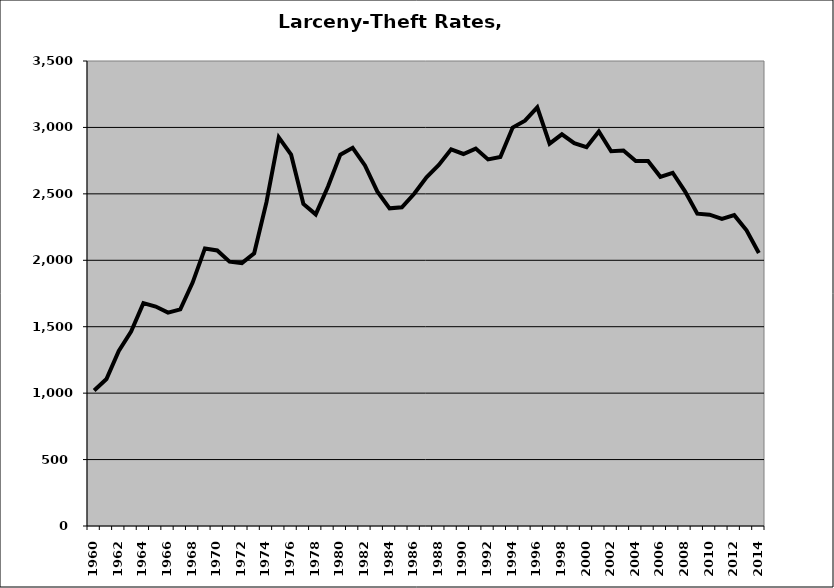
| Category | Larceny-Theft |
|---|---|
| 1960.0 | 1019.697 |
| 1961.0 | 1106.213 |
| 1962.0 | 1317.925 |
| 1963.0 | 1464.187 |
| 1964.0 | 1677.546 |
| 1965.0 | 1651.746 |
| 1966.0 | 1606.278 |
| 1967.0 | 1630.741 |
| 1968.0 | 1832.267 |
| 1969.0 | 2089.25 |
| 1970.0 | 2073.888 |
| 1971.0 | 1989.724 |
| 1972.0 | 1978.771 |
| 1973.0 | 2052.554 |
| 1974.0 | 2437.262 |
| 1975.0 | 2924.69 |
| 1976.0 | 2794.935 |
| 1977.0 | 2424.203 |
| 1978.0 | 2345.514 |
| 1979.0 | 2555.423 |
| 1980.0 | 2795.143 |
| 1981.0 | 2846.638 |
| 1982.0 | 2714.26 |
| 1983.0 | 2517.907 |
| 1984.0 | 2391.154 |
| 1985.0 | 2399.085 |
| 1986.0 | 2500.474 |
| 1987.0 | 2625.201 |
| 1988.0 | 2717.416 |
| 1989.0 | 2835.22 |
| 1990.0 | 2800.175 |
| 1991.0 | 2840.888 |
| 1992.0 | 2759.253 |
| 1993.0 | 2777.837 |
| 1994.0 | 2998.92 |
| 1995.0 | 3050.902 |
| 1996.0 | 3151.148 |
| 1997.0 | 2878.045 |
| 1998.0 | 2948.391 |
| 1999.0 | 2881.131 |
| 2000.0 | 2851.349 |
| 2001.0 | 2969.857 |
| 2002.0 | 2820.703 |
| 2003.0 | 2825.848 |
| 2004.0 | 2747.862 |
| 2005.0 | 2747.433 |
| 2006.0 | 2628.454 |
| 2007.0 | 2658.829 |
| 2008.0 | 2519.015 |
| 2009.0 | 2350.933 |
| 2010.0 | 2342.991 |
| 2011.0 | 2311.189 |
| 2012.0 | 2339.953 |
| 2013.0 | 2225.241 |
| 2014.0 | 2055.251 |